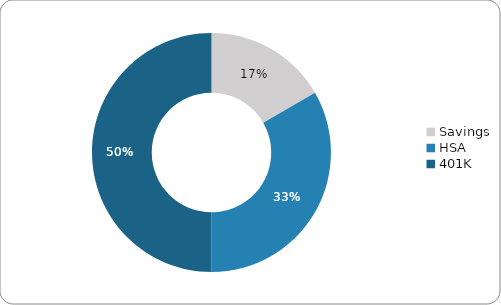
| Category | Series 0 |
|---|---|
| Savings | 1 |
| HSA | 2 |
| 401K | 3 |